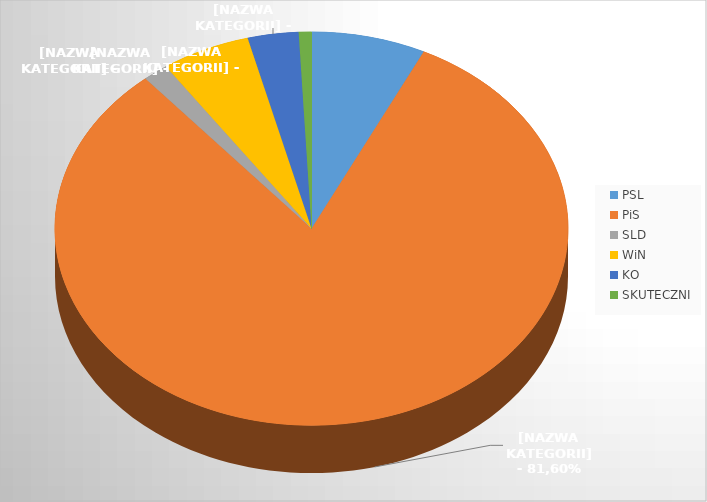
| Category | Series 0 |
|---|---|
| PSL | 9 |
| PiS | 102 |
| SLD | 2 |
| WiN | 7 |
| KO | 4 |
| SKUTECZNI | 1 |